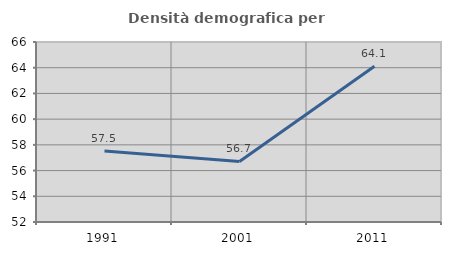
| Category | Densità demografica |
|---|---|
| 1991.0 | 57.526 |
| 2001.0 | 56.713 |
| 2011.0 | 64.117 |